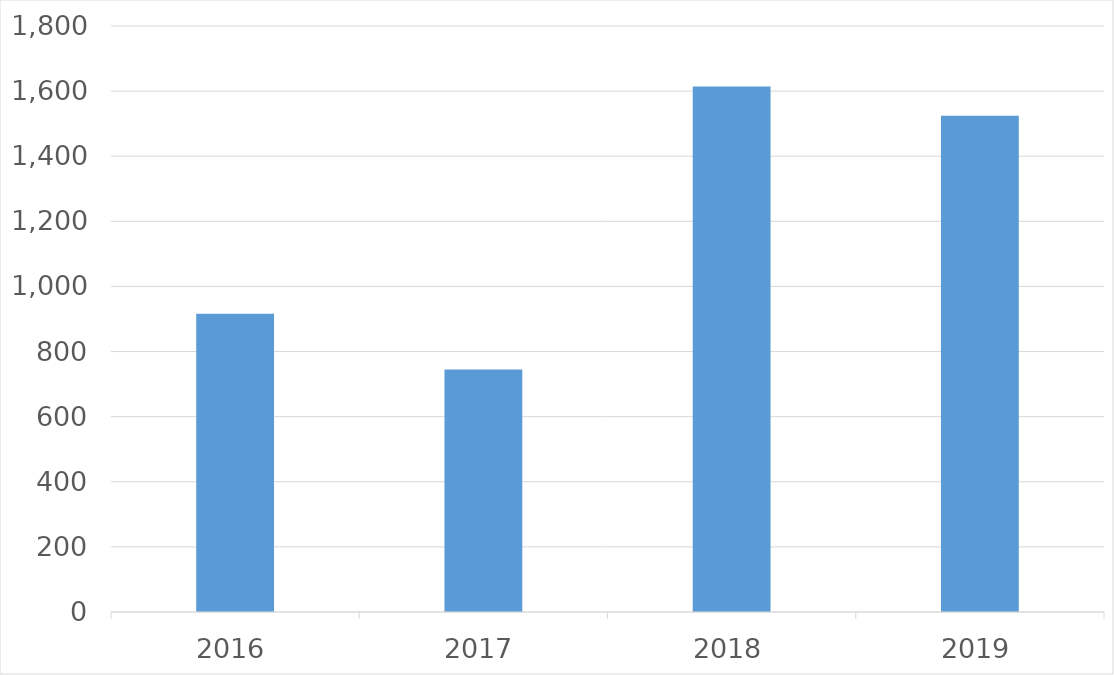
| Category | Series 0 |
|---|---|
| 2016 | 916 |
| 2017 | 745 |
| 2018 | 1614 |
| 2019 | 1524 |